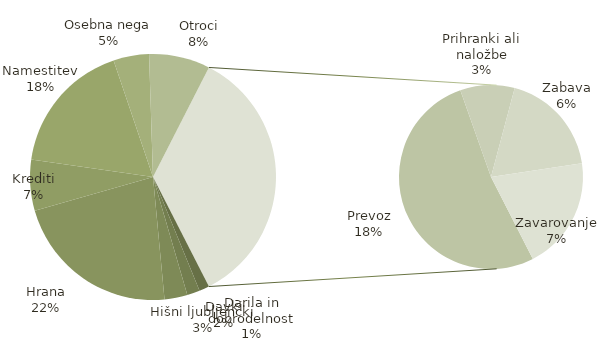
| Category | Vsota |
|---|---|
| Darila in dobrodelnost | 40 |
| Davki | 50 |
| Hišni ljubljenčki | 90 |
| Hrana | 660 |
| Krediti | 200 |
| Namestitev | 525 |
| Osebna nega | 140 |
| Otroci | 240 |
| Prevoz | 545 |
| Prihranki ali naložbe | 100 |
| Zabava | 193 |
| Zavarovanje | 208 |